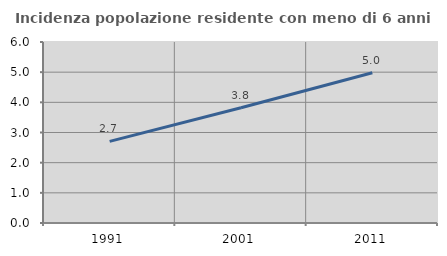
| Category | Incidenza popolazione residente con meno di 6 anni |
|---|---|
| 1991.0 | 2.706 |
| 2001.0 | 3.819 |
| 2011.0 | 4.983 |